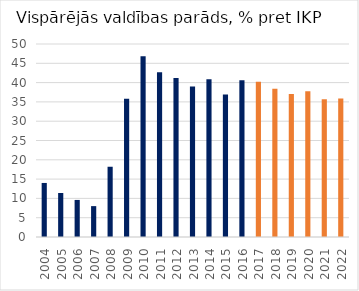
| Category | Latvia |
|---|---|
| 2004 | 14 |
| 2005 | 11.4 |
| 2006 | 9.6 |
| 2007 | 8 |
| 2008 | 18.2 |
| 2009 | 35.8 |
| 2010 | 46.8 |
| 2011 | 42.7 |
| 2012 | 41.2 |
| 2013 | 39 |
| 2014 | 40.9 |
| 2015 | 36.9 |
| 2016 | 40.6 |
| 2017 | 40.2 |
| 2018 | 38.4 |
| 2019 | 37.061 |
| 2020 | 37.741 |
| 2021 | 35.688 |
| 2022 | 35.885 |